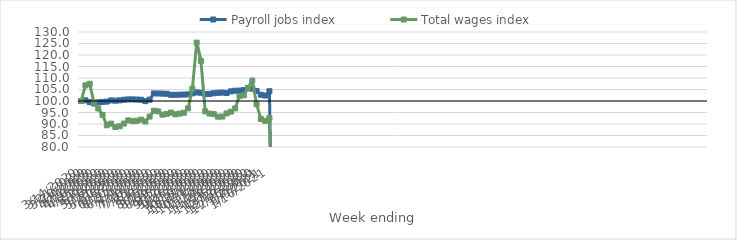
| Category | Payroll jobs index | Total wages index |
|---|---|---|
| 14/03/2020 | 100 | 100 |
| 21/03/2020 | 100.289 | 106.798 |
| 28/03/2020 | 99.507 | 107.488 |
| 04/04/2020 | 98.907 | 99.337 |
| 11/04/2020 | 99.417 | 96.753 |
| 18/04/2020 | 99.608 | 93.939 |
| 25/04/2020 | 99.748 | 89.455 |
| 02/05/2020 | 100.259 | 90.152 |
| 09/05/2020 | 100.15 | 88.685 |
| 16/05/2020 | 100.274 | 89.007 |
| 23/05/2020 | 100.563 | 90.189 |
| 30/05/2020 | 100.696 | 91.569 |
| 06/06/2020 | 100.706 | 91.216 |
| 13/06/2020 | 100.628 | 91.384 |
| 20/06/2020 | 100.555 | 91.895 |
| 27/06/2020 | 99.927 | 91.094 |
| 04/07/2020 | 100.586 | 93.24 |
| 11/07/2020 | 103.29 | 95.786 |
| 18/07/2020 | 103.258 | 95.495 |
| 25/07/2020 | 103.222 | 94.059 |
| 01/08/2020 | 103.135 | 94.388 |
| 08/08/2020 | 102.684 | 94.976 |
| 15/08/2020 | 102.691 | 94.215 |
| 22/08/2020 | 102.742 | 94.523 |
| 29/08/2020 | 102.807 | 94.869 |
| 05/09/2020 | 102.886 | 96.815 |
| 12/09/2020 | 103.327 | 105.356 |
| 19/09/2020 | 103.724 | 125.385 |
| 26/09/2020 | 103.59 | 117.421 |
| 03/10/2020 | 102.993 | 95.521 |
| 10/10/2020 | 103.11 | 94.534 |
| 17/10/2020 | 103.364 | 94.286 |
| 24/10/2020 | 103.554 | 93.183 |
| 31/10/2020 | 103.656 | 93.232 |
| 07/11/2020 | 103.461 | 94.604 |
| 14/11/2020 | 104.186 | 95.355 |
| 21/11/2020 | 104.471 | 96.796 |
| 28/11/2020 | 104.514 | 102.187 |
| 05/12/2020 | 104.72 | 102.466 |
| 12/12/2020 | 105.48 | 105.674 |
| 19/12/2020 | 105.374 | 108.848 |
| 26/12/2020 | 104.38 | 98.63 |
| 02/01/2021 | 102.709 | 92.179 |
| 09/01/2021 | 102.373 | 91.385 |
| 16/01/2021 | 104.244 | 92.626 |